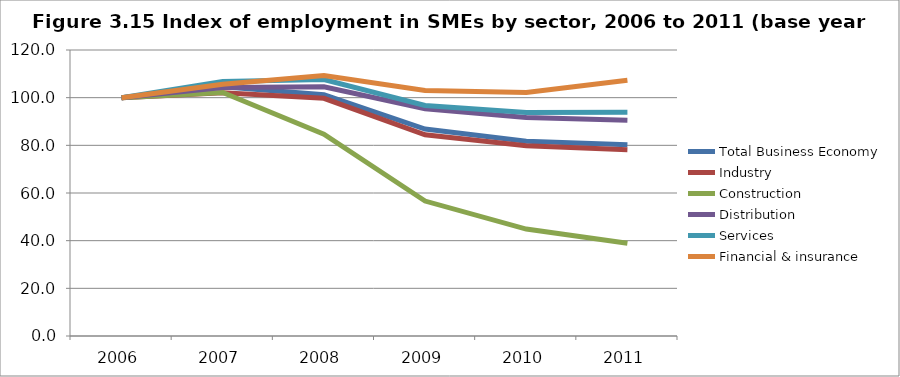
| Category | Total Business Economy | Industry | Construction | Distribution | Services | Financial & insurance  |
|---|---|---|---|---|---|---|
| 2006.0 | 100 | 100 | 100 | 100 | 100 | 100 |
| 2007.0 | 104.549 | 102.02 | 102.203 | 104.282 | 106.778 | 105.644 |
| 2008.0 | 101.205 | 99.714 | 84.697 | 104.561 | 107.589 | 109.313 |
| 2009.0 | 86.836 | 84.427 | 56.625 | 95.385 | 96.735 | 103.047 |
| 2010.0 | 81.752 | 79.852 | 44.853 | 91.716 | 93.74 | 102.165 |
| 2011.0 | 80.251 | 78.187 | 38.934 | 90.546 | 93.931 | 107.305 |